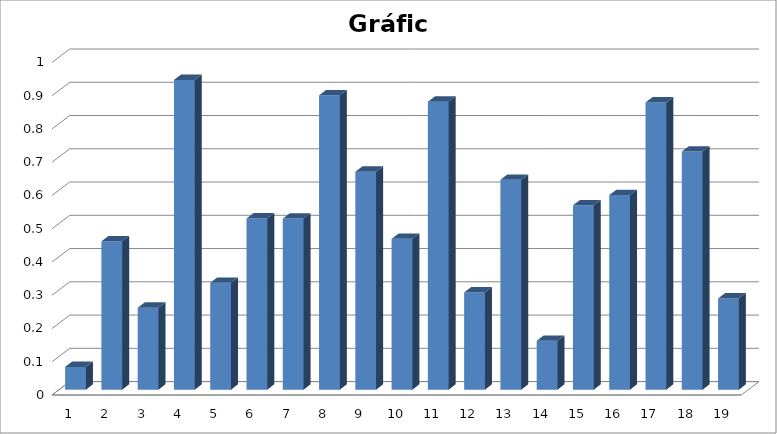
| Category | Series 0 |
|---|---|
| 0 | 0.068 |
| 1 | 0.446 |
| 2 | 0.246 |
| 3 | 0.931 |
| 4 | 0.321 |
| 5 | 0.515 |
| 6 | 0.514 |
| 7 | 0.885 |
| 8 | 0.655 |
| 9 | 0.454 |
| 10 | 0.866 |
| 11 | 0.292 |
| 12 | 0.631 |
| 13 | 0.147 |
| 14 | 0.554 |
| 15 | 0.585 |
| 16 | 0.864 |
| 17 | 0.716 |
| 18 | 0.274 |